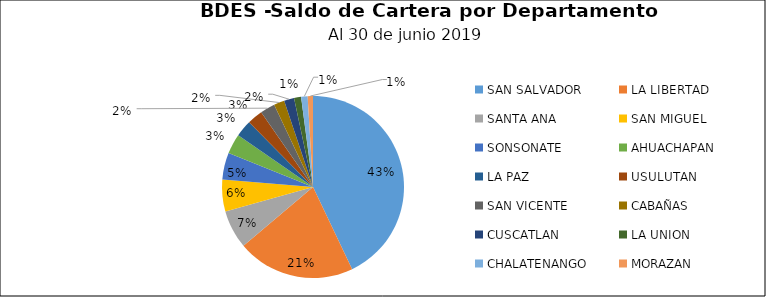
| Category | Saldo | Créditos |
|---|---|---|
| SAN SALVADOR | 171.089 | 6711 |
| LA LIBERTAD | 83.369 | 1774 |
| SANTA ANA | 27.144 | 1493 |
| SAN MIGUEL | 22.556 | 1939 |
| SONSONATE | 18.995 | 1154 |
| AHUACHAPAN | 14.213 | 702 |
| LA PAZ | 11.823 | 1217 |
| USULUTAN | 10.948 | 1227 |
| SAN VICENTE | 10.461 | 674 |
| CABAÑAS | 7.523 | 159 |
| CUSCATLAN | 7.099 | 389 |
| LA UNION | 4.973 | 633 |
| CHALATENANGO | 4.622 | 213 |
| MORAZAN | 3.748 | 484 |